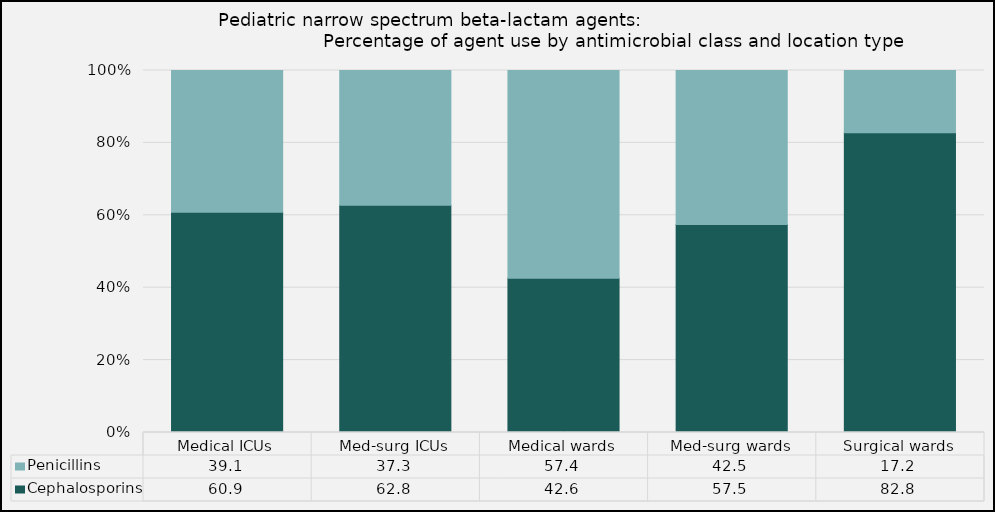
| Category | Cephalosporins | Penicillins |
|---|---|---|
| Medical ICUs | 60.86 | 39.14 |
| Med-surg ICUs | 62.75 | 37.25 |
| Medical wards | 42.64 | 57.36 |
| Med-surg wards | 57.47 | 42.53 |
| Surgical wards | 82.77 | 17.23 |